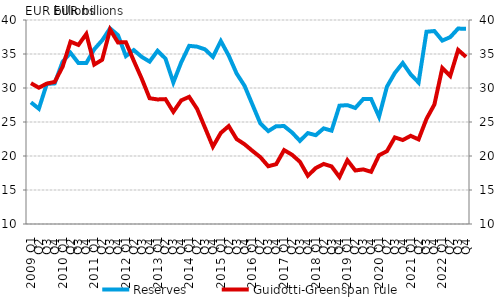
| Category | Reserves |
|---|---|
|   2009 Q1 | 27.89 |
| Q2 | 26.95 |
| Q3 | 30.603 |
| Q4 | 30.677 |
|  2010 Q1 | 33.852 |
| Q2 | 35.174 |
| Q3 | 33.676 |
| Q4 | 33.674 |
|  2011 Q1 | 35.692 |
| Q2 | 37.003 |
| Q3 | 38.764 |
| Q4 | 37.774 |
|  2012 Q1 | 34.697 |
| Q2 | 35.575 |
| Q3 | 34.577 |
| Q4 | 33.881 |
|  2013 Q1 | 35.467 |
| Q2 | 34.329 |
| Q3 | 30.815 |
| Q4 | 33.782 |
|  2014 Q1 | 36.197 |
| Q2 | 36.08 |
| Q3 | 35.684 |
| Q4 | 34.578 |
|  2015 Q1 | 36.908 |
| Q2 | 34.761 |
| Q3 | 32.127 |
| Q4 | 30.322 |
|  2016 Q1 | 27.551 |
| Q2 | 24.785 |
| Q3 | 23.661 |
| Q4 | 24.384 |
|  2017 Q1 | 24.398 |
| Q2 | 23.461 |
| Q3 | 22.226 |
| Q4 | 23.368 |
|  2018 Q1 | 23.059 |
| Q2 | 24.061 |
| Q3 | 23.727 |
| Q4 | 27.403 |
|  2019 Q1 | 27.478 |
| Q2 | 27.065 |
| Q3 | 28.367 |
| Q4 | 28.386 |
|  2020 Q1 | 25.772 |
| Q2 | 30.193 |
| Q3 | 32.212 |
| Q4 | 33.677 |
|  2021 Q1 | 32.006 |
| Q2 | 30.803 |
| Q3 | 38.273 |
| Q4 | 38.377 |
|  2022 Q1 | 36.972 |
| Q2 | 37.48 |
| Q3 | 38.74 |
| Q4 | 38.709 |